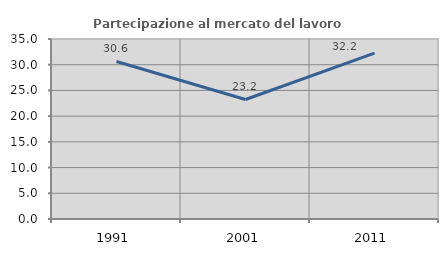
| Category | Partecipazione al mercato del lavoro  femminile |
|---|---|
| 1991.0 | 30.637 |
| 2001.0 | 23.238 |
| 2011.0 | 32.249 |